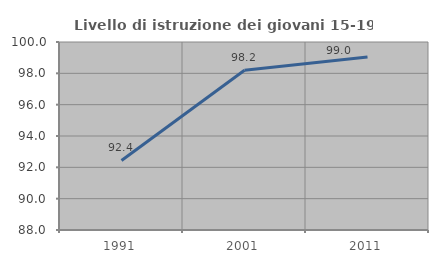
| Category | Livello di istruzione dei giovani 15-19 anni |
|---|---|
| 1991.0 | 92.44 |
| 2001.0 | 98.195 |
| 2011.0 | 99.038 |